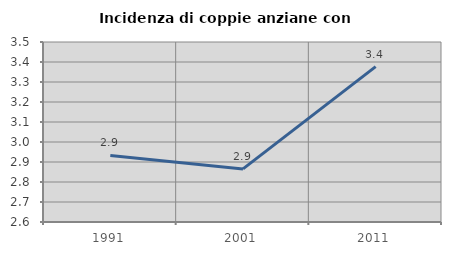
| Category | Incidenza di coppie anziane con figli |
|---|---|
| 1991.0 | 2.933 |
| 2001.0 | 2.865 |
| 2011.0 | 3.377 |